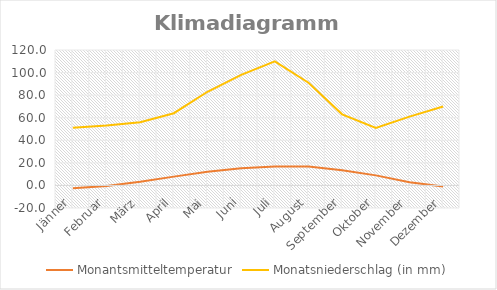
| Category | Monantsmitteltemperatur | Monatsniederschlag (in mm) |
|---|---|---|
| Jänner | -2.4 | 51 |
| Februar | -0.5 | 53 |
| März | 3.2 | 56 |
| April | 7.8 | 64 |
| Mai | 12.2 | 83 |
| Juni | 15.2 | 98 |
| Juli | 16.8 | 110 |
| August | 16.7 | 91 |
| September | 13.5 | 63 |
| Oktober | 8.9 | 51 |
| November | 2.8 | 61 |
| Dezember | -1 | 70 |